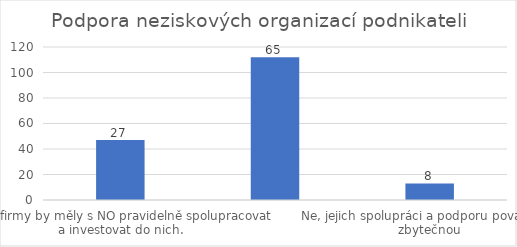
| Category | Počet respondentů |
|---|---|
| Ano, firmy by měly s NO pravidelně spolupracovat a investovat do nich. | 47 |
| Ano, příležitosně je vhodné, aby firmy NO podpořila. | 112 |
| Ne, jejich spolupráci a podporu považuji za zbytečnou | 13 |